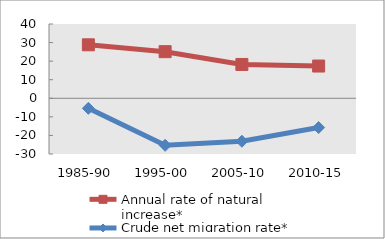
| Category | Annual rate of natural increase* | Crude net migration rate* |
|---|---|---|
| 1985-90 | 28.795 | -5.408 |
| 1995-00 | 25.103 | -25.337 |
| 2005-10 | 18.212 | -23.129 |
| 2010-15 | 17.364 | -15.748 |